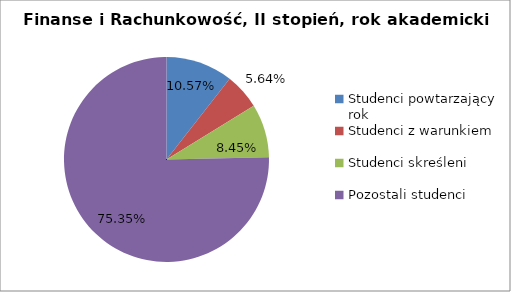
| Category | Series 0 |
|---|---|
| Studenci powtarzający rok | 15 |
| Studenci z warunkiem | 8 |
| Studenci skreśleni | 12 |
| Pozostali studenci | 107 |